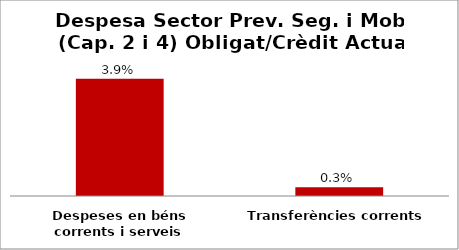
| Category | Series 0 |
|---|---|
| Despeses en béns corrents i serveis | 0.039 |
| Transferències corrents | 0.003 |